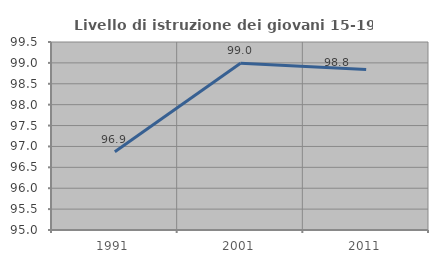
| Category | Livello di istruzione dei giovani 15-19 anni |
|---|---|
| 1991.0 | 96.875 |
| 2001.0 | 98.99 |
| 2011.0 | 98.843 |